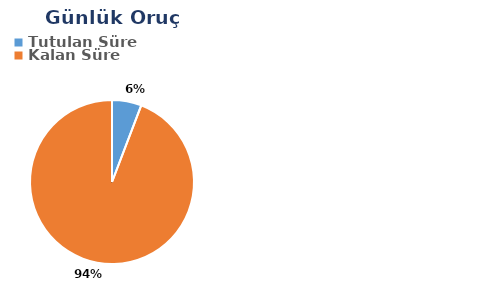
| Category | Günlük |
|---|---|
| Tutulan Süre | 0.034 |
| Kalan Süre | 0.553 |